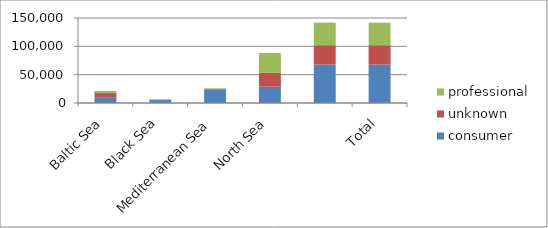
| Category | consumer | unknown | professional |
|---|---|---|---|
| Baltic Sea | 10221 | 7344 | 3625 |
| Black Sea | 5245 | 807 | 335 |
| Mediterranean Sea | 23760 | 1451 | 776 |
| North Sea | 28782 | 24429 | 35036 |
|  | 68008 | 34031 | 39772 |
| Total | 68008 | 34031 | 39772 |